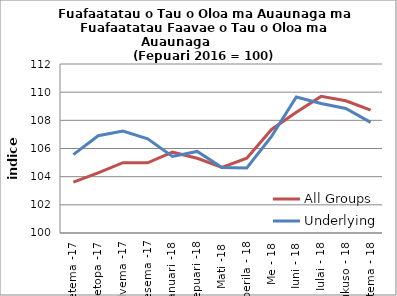
| Category | All Groups | Underlying |
|---|---|---|
| Setema -17 | 103.612 | 105.565 |
| Oketopa -17 | 104.27 | 106.905 |
| Nvema -17 | 104.991 | 107.237 |
| Tesema -17 | 104.983 | 106.688 |
| Ianuari -18 | 105.739 | 105.443 |
| Fepuari -18 | 105.308 | 105.79 |
| Mati -18 | 104.655 | 104.651 |
| Aperila - 18 | 105.309 | 104.614 |
| Me - 18 | 107.355 | 106.863 |
| Iuni - 18 | 108.567 | 109.659 |
| Iulai - 18 | 109.702 | 109.198 |
| Aukuso - 18 | 109.392 | 108.845 |
| Setema - 18 | 108.722 | 107.857 |